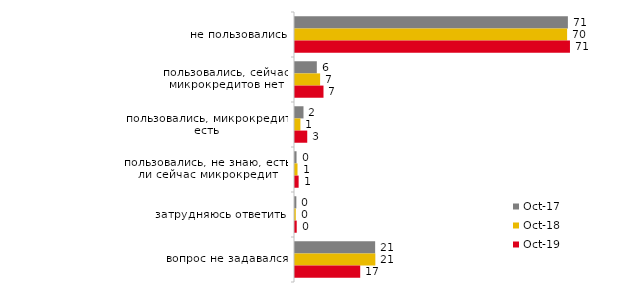
| Category | окт.17 | окт.18 | окт.19 |
|---|---|---|---|
| не пользовались | 70.65 | 70.45 | 71.188 |
| пользовались, сейчас микрокредитов нет | 5.65 | 6.5 | 7.376 |
| пользовались, микрокредит есть | 2.2 | 1.4 | 3.168 |
| пользовались, не знаю, есть ли сейчас микрокредит | 0.4 | 0.65 | 0.941 |
| затрудняюсь ответить | 0.35 | 0.2 | 0.446 |
| вопрос не задавался | 20.75 | 20.8 | 16.881 |